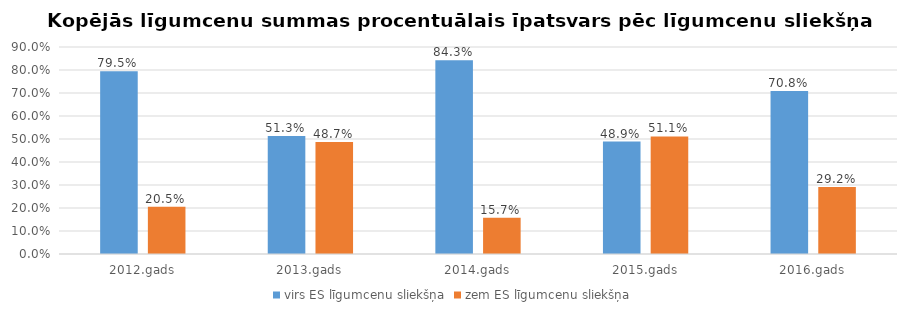
| Category | virs ES līgumcenu sliekšņa | zem ES līgumcenu sliekšņa |
|---|---|---|
| 2012.gads | 0.795 | 0.205 |
| 2013.gads | 0.513 | 0.487 |
| 2014.gads | 0.843 | 0.157 |
| 2015.gads | 0.489 | 0.511 |
| 2016.gads | 0.708 | 0.292 |